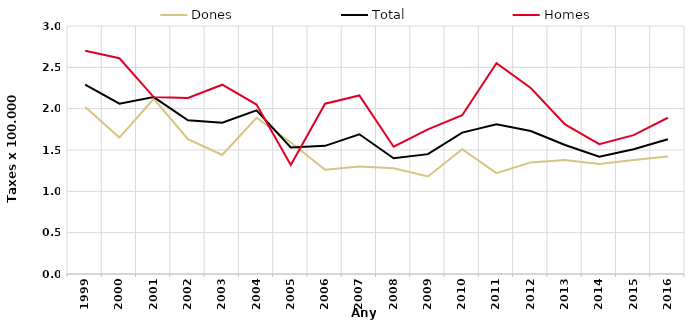
| Category | Dones | Total | Homes |
|---|---|---|---|
| 1999.0 | 2.02 | 2.29 | 2.7 |
| 2000.0 | 1.65 | 2.06 | 2.61 |
| 2001.0 | 2.12 | 2.14 | 2.14 |
| 2002.0 | 1.63 | 1.86 | 2.13 |
| 2003.0 | 1.44 | 1.83 | 2.29 |
| 2004.0 | 1.89 | 1.98 | 2.05 |
| 2005.0 | 1.59 | 1.53 | 1.32 |
| 2006.0 | 1.26 | 1.55 | 2.06 |
| 2007.0 | 1.3 | 1.69 | 2.16 |
| 2008.0 | 1.28 | 1.4 | 1.54 |
| 2009.0 | 1.18 | 1.45 | 1.75 |
| 2010.0 | 1.51 | 1.71 | 1.92 |
| 2011.0 | 1.22 | 1.81 | 2.55 |
| 2012.0 | 1.35 | 1.73 | 2.25 |
| 2013.0 | 1.38 | 1.56 | 1.81 |
| 2014.0 | 1.33 | 1.42 | 1.57 |
| 2015.0 | 1.38 | 1.51 | 1.68 |
| 2016.0 | 1.42 | 1.63 | 1.89 |